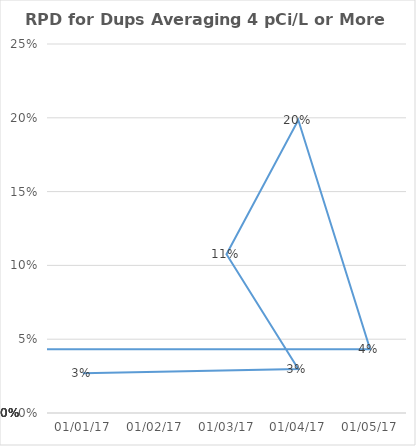
| Category | Series 0 |
|---|---|
| 2017-01-01 | 0.027 |
| 2017-01-04 | 0.03 |
| 2017-01-03 | 0.108 |
| 2017-01-04 | 0.198 |
| 2017-01-05 | 0.043 |
| nan | 0 |
| nan | 0 |
| nan | 0 |
| nan | 0 |
| nan | 0 |
| nan | 0 |